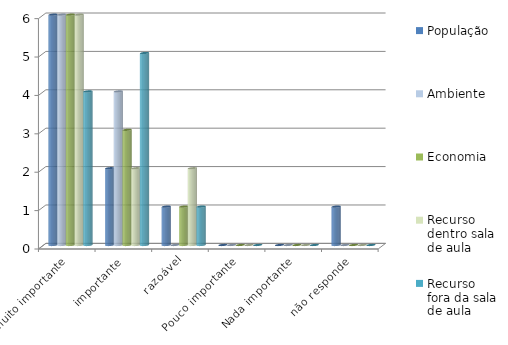
| Category | População | Ambiente | Economia | Recurso dentro sala de aula | Recurso fora da sala de aula |
|---|---|---|---|---|---|
| muito importante | 6 | 6 | 6 | 6 | 4 |
| importante | 2 | 4 | 3 | 2 | 5 |
| razoável | 1 | 0 | 1 | 2 | 1 |
| Pouco importante | 0 | 0 | 0 | 0 | 0 |
| Nada importante | 0 | 0 | 0 | 0 | 0 |
| não responde | 1 | 0 | 0 | 0 | 0 |